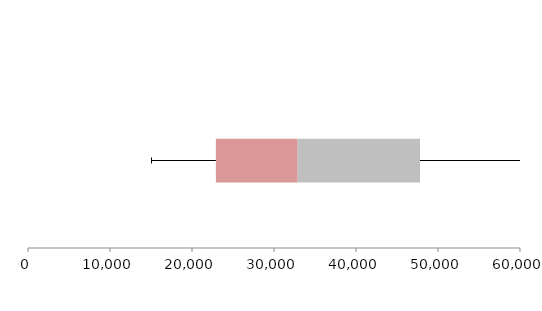
| Category | Series 1 | Series 2 | Series 3 |
|---|---|---|---|
| 0 | 22912.256 | 9971.885 | 14920.784 |